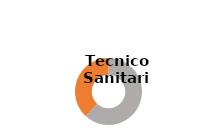
| Category | Series 0 |
|---|---|
| Donne  | 0.619 |
| Uomini  | 0.381 |